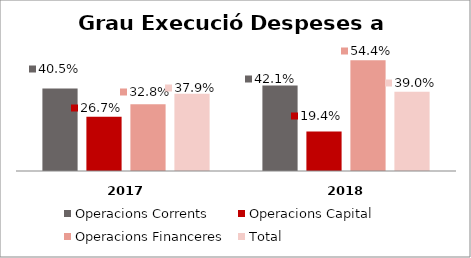
| Category | Operacions Corrents | Operacions Capital | Operacions Financeres | Total |
|---|---|---|---|---|
| 0 | 0.405 | 0.267 | 0.328 | 0.379 |
| 1 | 0.421 | 0.194 | 0.544 | 0.39 |